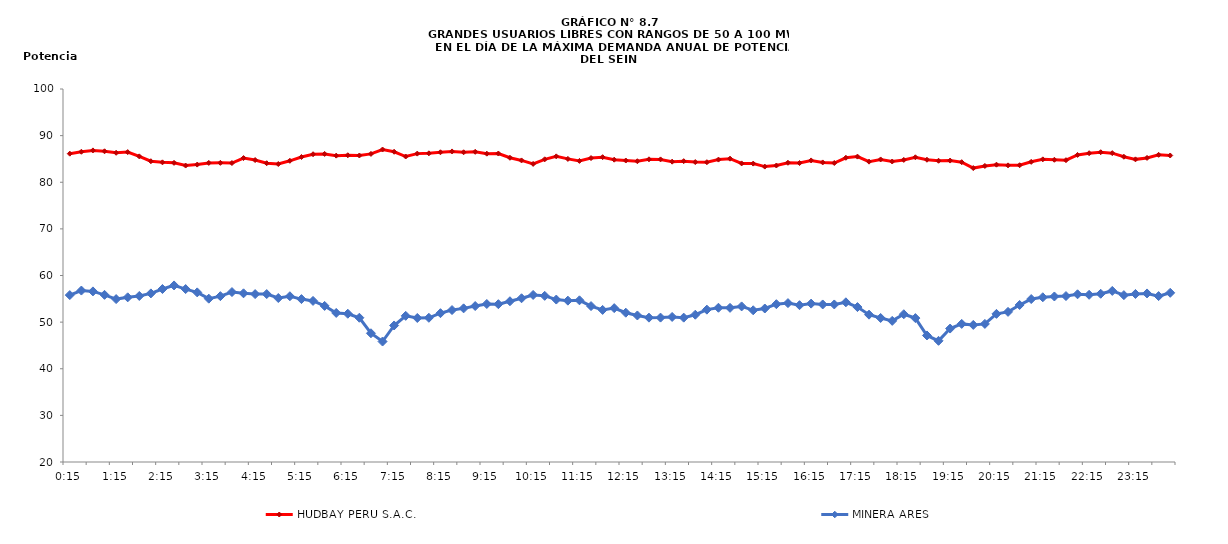
| Category | HUDBAY PERU S.A.C. | MINERA ARES |
|---|---|---|
| 2013-03-14 00:15:00 | 86.13 | 55.8 |
| 2013-03-14 00:30:00 | 86.54 | 56.77 |
| 2013-03-14 00:45:00 | 86.83 | 56.59 |
| 2013-03-14 01:00:00 | 86.64 | 55.85 |
| 2013-03-14 01:15:00 | 86.32 | 54.94 |
| 2013-03-14 01:30:00 | 86.47 | 55.32 |
| 2013-03-14 01:45:00 | 85.55 | 55.61 |
| 2013-03-14 02:00:00 | 84.51 | 56.16 |
| 2013-03-14 02:15:00 | 84.27 | 57.1 |
| 2013-03-14 02:30:00 | 84.16 | 57.87 |
| 2013-03-14 02:45:00 | 83.58 | 57.09 |
| 2013-03-14 03:00:00 | 83.79 | 56.38 |
| 2013-03-14 03:15:00 | 84.15 | 55.03 |
| 2013-03-14 03:30:00 | 84.16 | 55.57 |
| 2013-03-14 03:45:00 | 84.12 | 56.45 |
| 2013-03-14 04:00:00 | 85.19 | 56.18 |
| 2013-03-14 04:15:00 | 84.76 | 56.01 |
| 2013-03-14 04:30:00 | 84.08 | 56.02 |
| 2013-03-14 04:45:00 | 83.91 | 55.17 |
| 2013-03-14 05:00:00 | 84.6 | 55.55 |
| 2013-03-14 05:15:00 | 85.42 | 54.94 |
| 2013-03-14 05:30:00 | 86.01 | 54.55 |
| 2013-03-14 05:45:00 | 86.08 | 53.48 |
| 2013-03-14 06:00:00 | 85.71 | 51.97 |
| 2013-03-14 06:15:00 | 85.79 | 51.8 |
| 2013-03-14 06:30:00 | 85.74 | 50.94 |
| 2013-03-14 06:45:00 | 86.08 | 47.61 |
| 2013-03-14 07:00:00 | 87.02 | 45.84 |
| 2013-03-14 07:15:00 | 86.54 | 49.28 |
| 2013-03-14 07:30:00 | 85.52 | 51.35 |
| 2013-03-14 07:45:00 | 86.14 | 50.89 |
| 2013-03-14 08:00:00 | 86.2 | 50.93 |
| 2013-03-14 08:15:00 | 86.43 | 51.92 |
| 2013-03-14 08:30:00 | 86.61 | 52.59 |
| 2013-03-14 08:45:00 | 86.43 | 52.95 |
| 2013-03-14 09:00:00 | 86.53 | 53.45 |
| 2013-03-14 09:15:00 | 86.13 | 53.89 |
| 2013-03-14 09:30:00 | 86.16 | 53.85 |
| 2013-03-14 09:45:00 | 85.25 | 54.48 |
| 2013-03-14 10:00:00 | 84.68 | 55.12 |
| 2013-03-14 10:15:00 | 83.94 | 55.83 |
| 2013-03-14 10:30:00 | 84.92 | 55.64 |
| 2013-03-14 10:45:00 | 85.55 | 54.84 |
| 2013-03-14 11:00:00 | 85.01 | 54.61 |
| 2013-03-14 11:15:00 | 84.58 | 54.68 |
| 2013-03-14 11:30:00 | 85.19 | 53.44 |
| 2013-03-14 11:45:00 | 85.38 | 52.62 |
| 2013-03-14 12:00:00 | 84.84 | 53 |
| 2013-03-14 12:15:00 | 84.66 | 52.02 |
| 2013-03-14 12:30:00 | 84.51 | 51.43 |
| 2013-03-14 12:45:00 | 84.92 | 50.96 |
| 2013-03-14 13:00:00 | 84.9 | 50.97 |
| 2013-03-14 13:15:00 | 84.42 | 51.11 |
| 2013-03-14 13:30:00 | 84.52 | 50.96 |
| 2013-03-14 13:45:00 | 84.33 | 51.59 |
| 2013-03-14 14:00:00 | 84.3 | 52.68 |
| 2013-03-14 14:15:00 | 84.86 | 53.08 |
| 2013-03-14 14:30:00 | 85.06 | 53.06 |
| 2013-03-14 14:45:00 | 84.04 | 53.37 |
| 2013-03-14 15:00:00 | 84 | 52.54 |
| 2013-03-14 15:15:00 | 83.36 | 52.92 |
| 2013-03-14 15:30:00 | 83.59 | 53.85 |
| 2013-03-14 15:45:00 | 84.18 | 54.08 |
| 2013-03-14 16:00:00 | 84.12 | 53.63 |
| 2013-03-14 16:15:00 | 84.68 | 53.97 |
| 2013-03-14 16:30:00 | 84.25 | 53.79 |
| 2013-03-14 16:45:00 | 84.13 | 53.79 |
| 2013-03-14 17:00:00 | 85.25 | 54.25 |
| 2013-03-14 17:15:00 | 85.5 | 53.23 |
| 2013-03-14 17:30:00 | 84.42 | 51.6 |
| 2013-03-14 17:45:00 | 84.89 | 50.89 |
| 2013-03-14 18:00:00 | 84.45 | 50.27 |
| 2013-03-14 18:15:00 | 84.79 | 51.69 |
| 2013-03-14 18:30:00 | 85.35 | 50.86 |
| 2013-03-14 18:45:00 | 84.83 | 47.14 |
| 2013-03-14 19:00:00 | 84.61 | 45.99 |
| 2013-03-14 19:15:00 | 84.65 | 48.62 |
| 2013-03-14 19:30:00 | 84.3 | 49.62 |
| 2013-03-14 19:45:00 | 83.04 | 49.4 |
| 2013-03-14 20:00:00 | 83.5 | 49.62 |
| 2013-03-14 20:15:00 | 83.77 | 51.77 |
| 2013-03-14 20:30:00 | 83.62 | 52.2 |
| 2013-03-14 20:45:00 | 83.65 | 53.68 |
| 2013-03-14 21:00:00 | 84.38 | 54.95 |
| 2013-03-14 21:15:00 | 84.91 | 55.33 |
| 2013-03-14 21:30:00 | 84.82 | 55.5 |
| 2013-03-14 21:45:00 | 84.73 | 55.59 |
| 2013-03-14 22:00:00 | 85.86 | 55.97 |
| 2013-03-14 22:15:00 | 86.23 | 55.86 |
| 2013-03-14 22:30:00 | 86.44 | 56.08 |
| 2013-03-14 22:45:00 | 86.24 | 56.69 |
| 2013-03-14 23:00:00 | 85.47 | 55.79 |
| 2013-03-14 23:15:00 | 84.91 | 56.04 |
| 2013-03-14 23:30:00 | 85.22 | 56.15 |
| 2013-03-14 23:45:00 | 85.88 | 55.58 |
| 2013-03-15 | 85.74 | 56.29 |